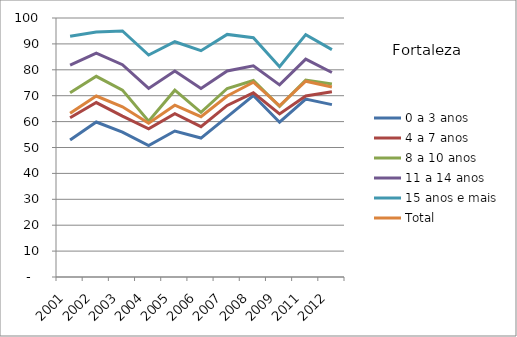
| Category | 0 a 3 anos | 4 a 7 anos | 8 a 10 anos | 11 a 14 anos | 15 anos e mais | Total |
|---|---|---|---|---|---|---|
| 2001.0 | 52.86 | 61.47 | 71.1 | 81.81 | 92.93 | 63.23 |
| 2002.0 | 59.84 | 67.35 | 77.47 | 86.42 | 94.56 | 69.87 |
| 2003.0 | 55.9 | 62.1 | 72.16 | 81.95 | 94.98 | 65.72 |
| 2004.0 | 50.74 | 57.19 | 60.15 | 72.79 | 85.72 | 59.4 |
| 2005.0 | 56.35 | 63.02 | 72.12 | 79.51 | 90.84 | 66.33 |
| 2006.0 | 53.64 | 58.06 | 63.59 | 72.79 | 87.39 | 61.9 |
| 2007.0 | 61.81 | 66.24 | 72.78 | 79.54 | 93.67 | 69.9 |
| 2008.0 | 70.05 | 71.09 | 75.85 | 81.55 | 92.39 | 75.19 |
| 2009.0 | 59.75 | 62.95 | 65.9 | 74.19 | 81.2 | 66.11 |
| 2011.0 | 68.7 | 69.89 | 76.05 | 84.13 | 93.6 | 75.58 |
| 2012.0 | 66.55 | 71.49 | 74.52 | 78.97 | 87.78 | 73.34 |